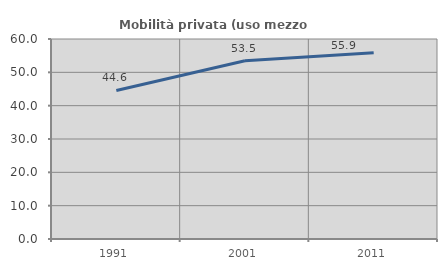
| Category | Mobilità privata (uso mezzo privato) |
|---|---|
| 1991.0 | 44.569 |
| 2001.0 | 53.498 |
| 2011.0 | 55.882 |